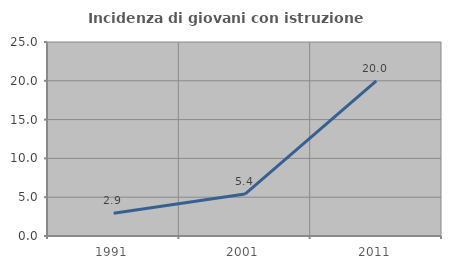
| Category | Incidenza di giovani con istruzione universitaria |
|---|---|
| 1991.0 | 2.941 |
| 2001.0 | 5.405 |
| 2011.0 | 20 |